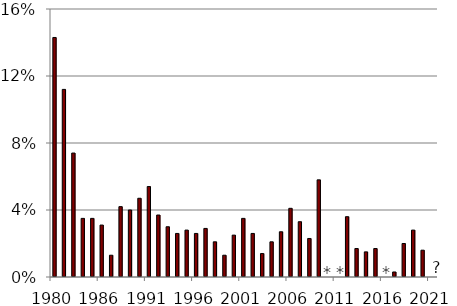
| Category | Series 0 |
|---|---|
| 1980.0 | 0.143 |
| 1981.0 | 0.112 |
| 1982.0 | 0.074 |
| 1984.0 | 0.035 |
| 1985.0 | 0.035 |
| 1986.0 | 0.031 |
| 1987.0 | 0.013 |
| 1988.0 | 0.042 |
| 1989.0 | 0.04 |
| 1990.0 | 0.047 |
| 1991.0 | 0.054 |
| 1992.0 | 0.037 |
| 1993.0 | 0.03 |
| 1994.0 | 0.026 |
| 1995.0 | 0.028 |
| 1996.0 | 0.026 |
| 1997.0 | 0.029 |
| 1998.0 | 0.021 |
| 1999.0 | 0.013 |
| 2000.0 | 0.025 |
| 2001.0 | 0.035 |
| 2002.0 | 0.026 |
| 2003.0 | 0.014 |
| 2004.0 | 0.021 |
| 2005.0 | 0.027 |
| 2006.0 | 0.041 |
| 2007.0 | 0.033 |
| 2008.0 | 0.023 |
| 2009.0 | 0.058 |
| 2010.0 | 0 |
| 2011.0 | 0 |
| 2012.0 | 0.036 |
| 2013.0 | 0.017 |
| 2014.0 | 0.015 |
| 2015.0 | 0.017 |
| 2016.0 | 0 |
| 2017.0 | 0.003 |
| 2018.0 | 0.02 |
| 2019.0 | 0.028 |
| 2020.0 | 0.016 |
| 2021.0 | 0 |